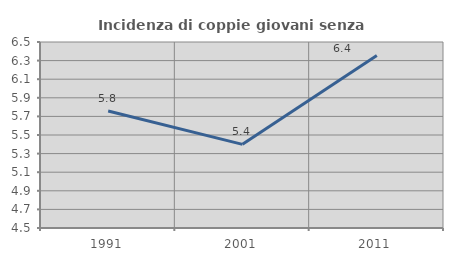
| Category | Incidenza di coppie giovani senza figli |
|---|---|
| 1991.0 | 5.758 |
| 2001.0 | 5.4 |
| 2011.0 | 6.354 |